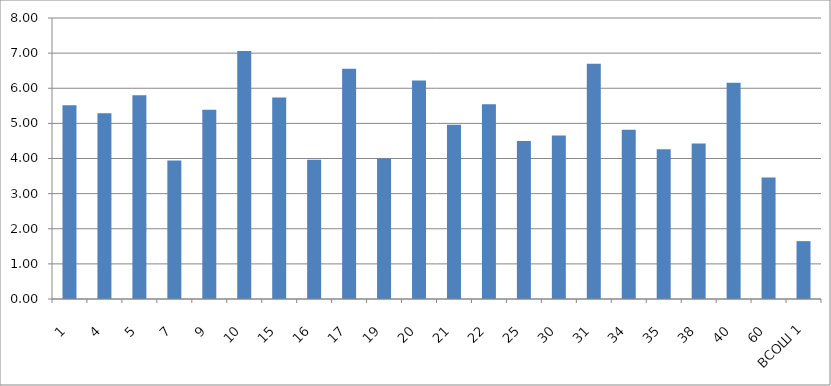
| Category | Series 0 |
|---|---|
| 1 | 5.514 |
| 4 | 5.292 |
| 5 | 5.8 |
| 7 | 3.944 |
| 9 | 5.391 |
| 10 | 7.064 |
| 15 | 5.737 |
| 16 | 3.964 |
| 17 | 6.556 |
| 19 | 4 |
| 20 | 6.217 |
| 21 | 4.96 |
| 22 | 5.542 |
| 25 | 4.5 |
| 30 | 4.652 |
| 31 | 6.7 |
| 34 | 4.821 |
| 35 | 4.261 |
| 38 | 4.429 |
| 40 | 6.154 |
| 60 | 3.458 |
| ВСОШ 1 | 1.647 |